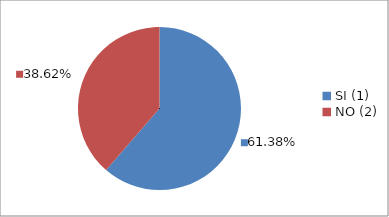
| Category | Series 0 |
|---|---|
| SI (1) | 0.614 |
| NO (2) | 0.386 |